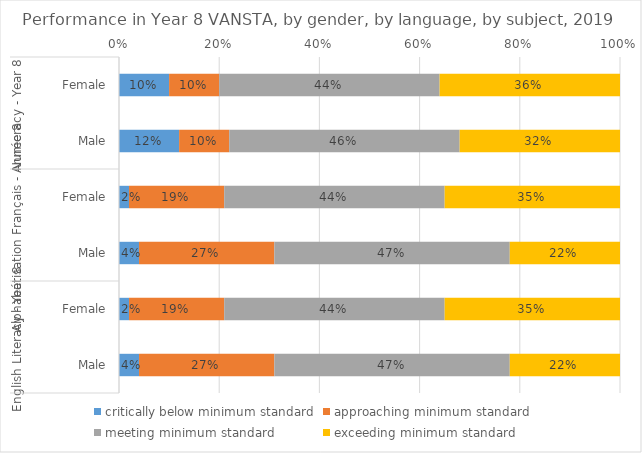
| Category | critically below minimum standard | approaching minimum standard | meeting minimum standard | exceeding minimum standard |
|---|---|---|---|---|
| 0 | 0.1 | 0.1 | 0.44 | 0.36 |
| 1 | 0.12 | 0.1 | 0.46 | 0.32 |
| 2 | 0.02 | 0.19 | 0.44 | 0.35 |
| 3 | 0.04 | 0.27 | 0.47 | 0.22 |
| 4 | 0.02 | 0.19 | 0.44 | 0.35 |
| 5 | 0.04 | 0.27 | 0.47 | 0.22 |